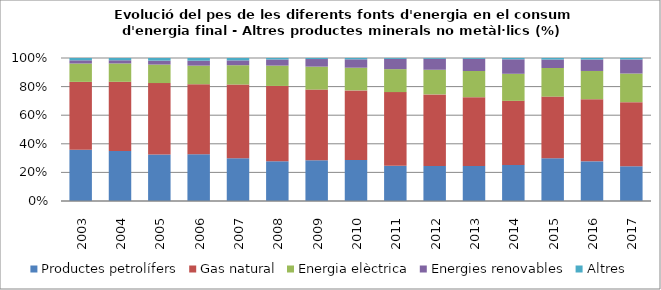
| Category | Productes petrolífers | Gas natural | Energia elèctrica | Energies renovables | Altres |
|---|---|---|---|---|---|
| 2003.0 | 129 | 170.6 | 46.2 | 8.1 | 5.8 |
| 2004.0 | 130.5 | 180 | 47.8 | 8.3 | 5.9 |
| 2005.0 | 121.2 | 186 | 48.2 | 10.3 | 6.8 |
| 2006.0 | 122.1 | 182.9 | 48.6 | 12.9 | 7 |
| 2007.0 | 107.6 | 186.4 | 48.7 | 12.2 | 6 |
| 2008.0 | 81.6 | 154.7 | 41.8 | 12.5 | 3.1 |
| 2009.0 | 59.1 | 102.5 | 33.3 | 11 | 1.5 |
| 2010.0 | 55.3 | 94 | 30.6 | 11.3 | 1.8 |
| 2011.0 | 45.8 | 95.9 | 29.9 | 13.4 | 1.1 |
| 2012.0 | 37.5 | 76.8 | 26.4 | 11.8 | 0.8 |
| 2013.0 | 33.7 | 66.2 | 25.2 | 11.7 | 0.8 |
| 2014.0 | 32.7 | 58 | 24.5 | 13.1 | 1.2 |
| 2015.0 | 38.6 | 55.5 | 25.8 | 7.6 | 1.4 |
| 2016.0 | 36.4 | 57 | 25.9 | 10.5 | 1.4 |
| 2017.0 | 33.1 | 61.1 | 27.3 | 13.4 | 1.4 |